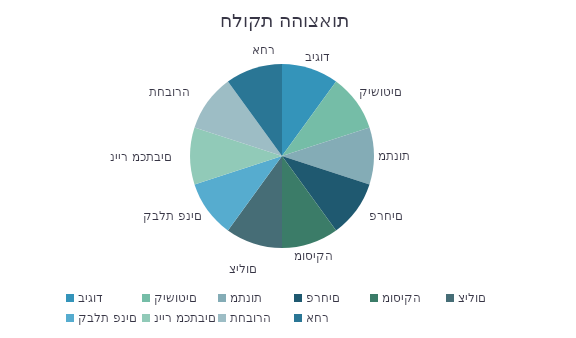
| Category | סכום |
|---|---|
| ביגוד | 1 |
| קישוטים | 1 |
| מתנות | 1 |
| פרחים | 1 |
| מוסיקה | 1 |
| צילום | 1 |
| קבלת פנים | 1 |
| נייר מכתבים | 1 |
| תחבורה | 1 |
| אחר | 1 |